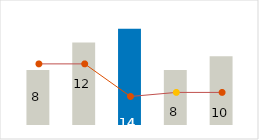
| Category | Profit |
|---|---|
| 0 | 8 |
| 1 | 12 |
| 2 | 14 |
| 3 | 8 |
| 4 | 10 |